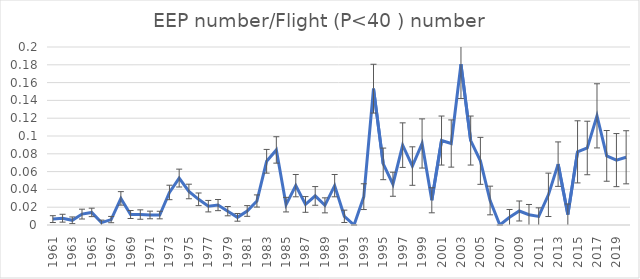
| Category | Series 0 |
|---|---|
| 1961.0 | 0.007 |
| 1962.0 | 0.008 |
| 1963.0 | 0.005 |
| 1964.0 | 0.012 |
| 1965.0 | 0.014 |
| 1966.0 | 0.003 |
| 1967.0 | 0.006 |
| 1968.0 | 0.03 |
| 1969.0 | 0.012 |
| 1970.0 | 0.012 |
| 1971.0 | 0.011 |
| 1972.0 | 0.011 |
| 1973.0 | 0.037 |
| 1974.0 | 0.053 |
| 1975.0 | 0.038 |
| 1976.0 | 0.029 |
| 1977.0 | 0.021 |
| 1978.0 | 0.022 |
| 1979.0 | 0.016 |
| 1980.0 | 0.009 |
| 1981.0 | 0.016 |
| 1982.0 | 0.027 |
| 1983.0 | 0.072 |
| 1984.0 | 0.084 |
| 1985.0 | 0.023 |
| 1986.0 | 0.044 |
| 1987.0 | 0.023 |
| 1988.0 | 0.033 |
| 1989.0 | 0.022 |
| 1990.0 | 0.044 |
| 1991.0 | 0.01 |
| 1992.0 | 0 |
| 1993.0 | 0.032 |
| 1994.0 | 0.153 |
| 1995.0 | 0.069 |
| 1996.0 | 0.046 |
| 1997.0 | 0.09 |
| 1998.0 | 0.066 |
| 1999.0 | 0.092 |
| 2000.0 | 0.028 |
| 2001.0 | 0.095 |
| 2002.0 | 0.092 |
| 2003.0 | 0.181 |
| 2004.0 | 0.095 |
| 2005.0 | 0.072 |
| 2006.0 | 0.028 |
| 2007.0 | 0 |
| 2008.0 | 0.009 |
| 2009.0 | 0.016 |
| 2010.0 | 0.011 |
| 2011.0 | 0.01 |
| 2012.0 | 0.034 |
| 2013.0 | 0.068 |
| 2014.0 | 0.012 |
| 2015.0 | 0.082 |
| 2016.0 | 0.087 |
| 2017.0 | 0.123 |
| 2018.0 | 0.078 |
| 2019.0 | 0.073 |
| 2020.0 | 0.076 |